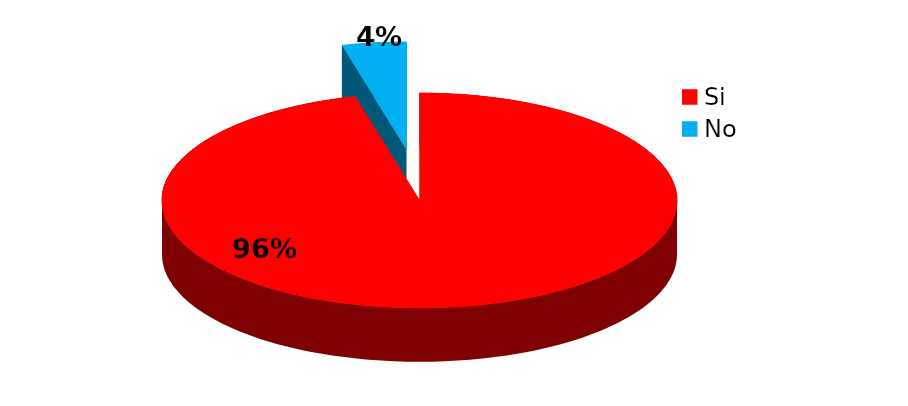
| Category | Series 0 |
|---|---|
| Si | 119 |
| No | 5 |